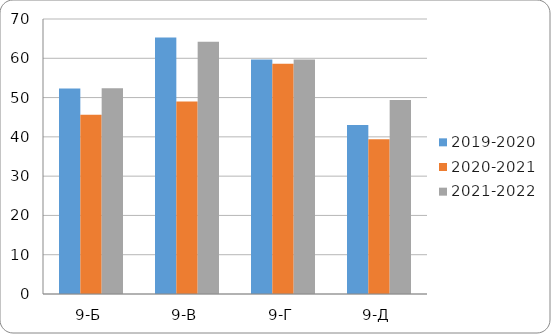
| Category | 2019-2020 | 2020-2021 | 2021-2022 |
|---|---|---|---|
| 9-Б | 52.3 | 45.6 | 52.4 |
| 9-В | 65.3 | 49 | 64.2 |
| 9-Г | 59.7 | 58.6 | 59.7 |
| 9-Д | 43 | 39.4 | 49.4 |